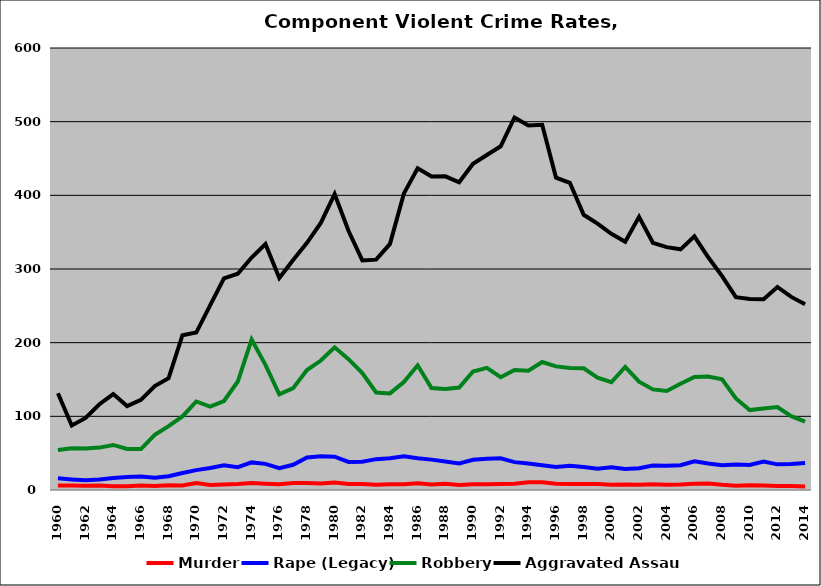
| Category | Murder | Rape (Legacy) | Robbery | Aggravated Assault |
|---|---|---|---|---|
| 1960.0 | 5.99 | 16.05 | 54.218 | 131.397 |
| 1961.0 | 6.039 | 14.378 | 56.506 | 87.563 |
| 1962.0 | 5.699 | 13.121 | 56.395 | 97.747 |
| 1963.0 | 5.965 | 14.24 | 57.537 | 116.421 |
| 1964.0 | 5.25 | 16.382 | 61.164 | 130.234 |
| 1965.0 | 4.975 | 17.786 | 55.659 | 113.868 |
| 1966.0 | 6.057 | 18.294 | 55.501 | 122.373 |
| 1967.0 | 5.569 | 16.707 | 74.908 | 141.004 |
| 1968.0 | 6.287 | 18.743 | 86.707 | 151.856 |
| 1969.0 | 6.025 | 23.036 | 99.941 | 210.159 |
| 1970.0 | 9.478 | 26.968 | 120.17 | 213.712 |
| 1971.0 | 6.706 | 29.908 | 113.304 | 250.676 |
| 1972.0 | 7.301 | 33.419 | 120.823 | 287.352 |
| 1973.0 | 8.115 | 30.952 | 147.279 | 293.586 |
| 1974.0 | 9.568 | 37.483 | 204.18 | 315.513 |
| 1975.0 | 8.588 | 35.477 | 169.964 | 333.813 |
| 1976.0 | 7.797 | 29.692 | 129.912 | 287.885 |
| 1977.0 | 9.451 | 34.233 | 138.197 | 312.326 |
| 1978.0 | 9.388 | 44.18 | 162.914 | 335.599 |
| 1979.0 | 8.939 | 45.714 | 175.714 | 362.612 |
| 1980.0 | 10.275 | 45.187 | 193.639 | 401.752 |
| 1981.0 | 8.127 | 38.095 | 177.623 | 351.951 |
| 1982.0 | 8.252 | 38.462 | 158.636 | 311.608 |
| 1983.0 | 7.189 | 41.883 | 132.4 | 312.69 |
| 1984.0 | 7.796 | 43.105 | 131.117 | 334.065 |
| 1985.0 | 7.97 | 45.748 | 146.533 | 402.259 |
| 1986.0 | 9.255 | 42.961 | 169.249 | 436.81 |
| 1987.0 | 7.472 | 41.229 | 138.423 | 425.458 |
| 1988.0 | 8.482 | 38.806 | 137.046 | 425.793 |
| 1989.0 | 6.665 | 36.164 | 139.033 | 417.688 |
| 1990.0 | 7.748 | 40.925 | 160.89 | 442.81 |
| 1991.0 | 7.76 | 42.4 | 165.733 | 454.827 |
| 1992.0 | 8.142 | 42.98 | 153.105 | 466.597 |
| 1993.0 | 8.613 | 37.805 | 162.907 | 505.666 |
| 1994.0 | 10.454 | 35.951 | 161.988 | 494.748 |
| 1995.0 | 10.408 | 33.618 | 173.755 | 495.709 |
| 1996.0 | 8.514 | 31.188 | 167.773 | 424.029 |
| 1997.0 | 8.233 | 32.755 | 165.686 | 417.058 |
| 1998.0 | 8.053 | 31.077 | 165.239 | 373.57 |
| 1999.0 | 8.036 | 28.943 | 152.522 | 361.612 |
| 2000.0 | 6.997 | 30.737 | 146.259 | 347.735 |
| 2001.0 | 7.537 | 28.604 | 167.101 | 337.085 |
| 2002.0 | 7.112 | 29.553 | 147.028 | 370.806 |
| 2003.0 | 7.904 | 33.266 | 136.56 | 335.567 |
| 2004.0 | 7.213 | 33.032 | 134.515 | 329.641 |
| 2005.0 | 7.475 | 33.697 | 144.112 | 326.692 |
| 2006.0 | 8.53 | 38.954 | 153.528 | 344.355 |
| 2007.0 | 8.661 | 35.985 | 153.91 | 315.898 |
| 2008.0 | 6.985 | 33.742 | 150.122 | 290.336 |
| 2009.0 | 5.761 | 34.552 | 124.307 | 261.834 |
| 2010.0 | 6.399 | 33.87 | 108.526 | 259.292 |
| 2011.0 | 6.139 | 38.64 | 110.479 | 258.964 |
| 2012.0 | 5.465 | 34.834 | 112.698 | 275.585 |
| 2013.0 | 5.35 | 35.328 | 100.317 | 262.11 |
| 2014.0 | 4.739 | 36.604 | 92.832 | 252.099 |